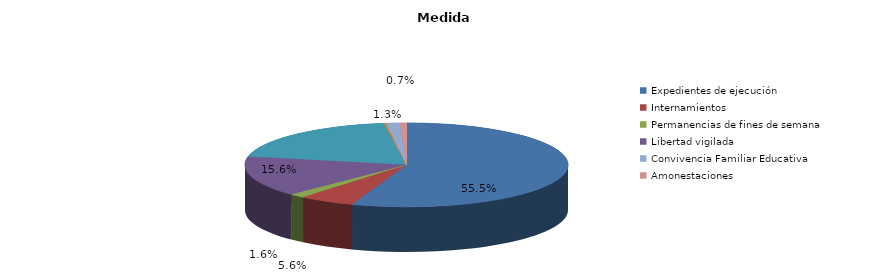
| Category | Series 0 |
|---|---|
| Expedientes de ejecución | 249 |
| Internamientos | 25 |
| Permanencias de fines de semana | 7 |
| Libertad vigilada | 70 |
| Prestaciones en beneficio de la comunidad | 88 |
| Privación de permisos y licencias | 1 |
| Convivencia Familiar Educativa | 6 |
| Amonestaciones | 3 |